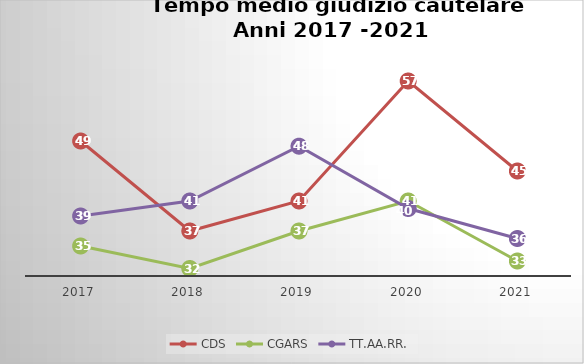
| Category | CDS | CGARS | TT.AA.RR. |
|---|---|---|---|
| 2017.0 | 49 | 35 | 39 |
| 2018.0 | 37 | 32 | 41 |
| 2019.0 | 41 | 37 | 48.307 |
| 2020.0 | 57 | 41 | 40 |
| 2021.0 | 45 | 33 | 36 |